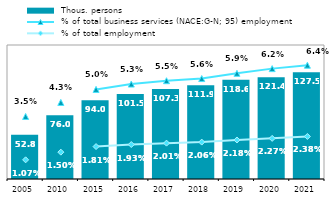
| Category |  Thous. persons |
|---|---|
| 2005.0 | 52.808 |
| 2010.0 | 76.014 |
| 2015.0 | 94.048 |
| 2016.0 | 101.515 |
| 2017.0 | 107.325 |
| 2018.0 | 111.859 |
| 2019.0 | 118.573 |
| 2020.0 | 121.393 |
| 2021.0 | 127.528 |